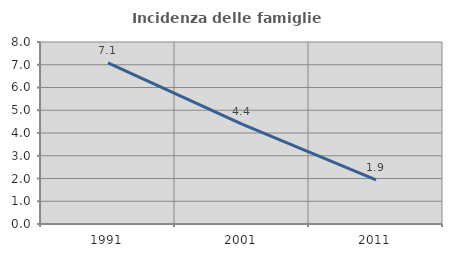
| Category | Incidenza delle famiglie numerose |
|---|---|
| 1991.0 | 7.08 |
| 2001.0 | 4.393 |
| 2011.0 | 1.944 |